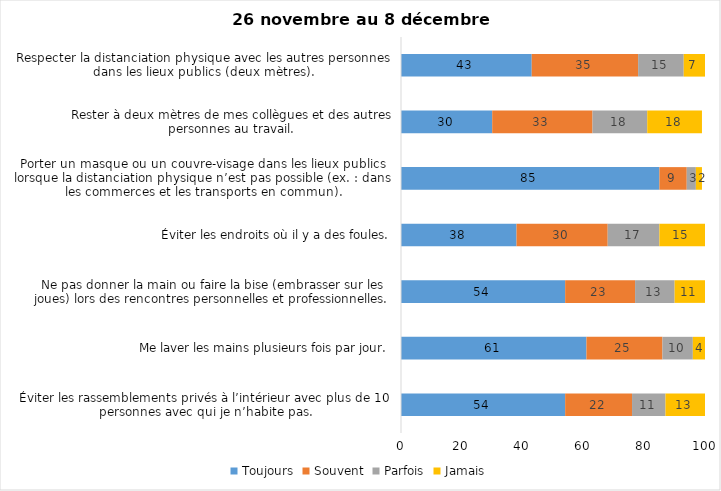
| Category | Toujours | Souvent | Parfois | Jamais |
|---|---|---|---|---|
| Éviter les rassemblements privés à l’intérieur avec plus de 10 personnes avec qui je n’habite pas. | 54 | 22 | 11 | 13 |
| Me laver les mains plusieurs fois par jour. | 61 | 25 | 10 | 4 |
| Ne pas donner la main ou faire la bise (embrasser sur les joues) lors des rencontres personnelles et professionnelles. | 54 | 23 | 13 | 11 |
| Éviter les endroits où il y a des foules. | 38 | 30 | 17 | 15 |
| Porter un masque ou un couvre-visage dans les lieux publics lorsque la distanciation physique n’est pas possible (ex. : dans les commerces et les transports en commun). | 85 | 9 | 3 | 2 |
| Rester à deux mètres de mes collègues et des autres personnes au travail. | 30 | 33 | 18 | 18 |
| Respecter la distanciation physique avec les autres personnes dans les lieux publics (deux mètres). | 43 | 35 | 15 | 7 |